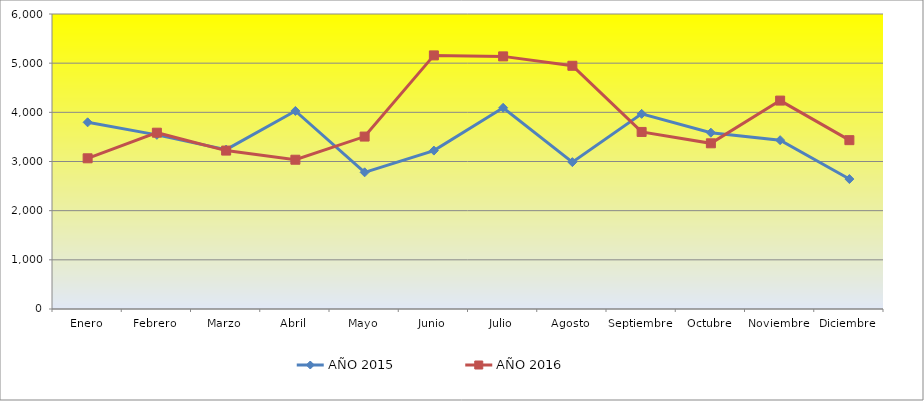
| Category | AÑO 2015 | AÑO 2016 |
|---|---|---|
| Enero | 3797 | 3065 |
| Febrero | 3542 | 3586 |
| Marzo | 3242 | 3222 |
| Abril | 4028 | 3036 |
| Mayo | 2780 | 3507 |
| Junio | 3222 | 5158 |
| Julio | 4092 | 5138 |
| Agosto | 2987 | 4947 |
| Septiembre | 3969 | 3601 |
| Octubre | 3586 | 3370 |
| Noviembre | 3434 | 4239 |
| Diciembre | 2643 | 3434 |